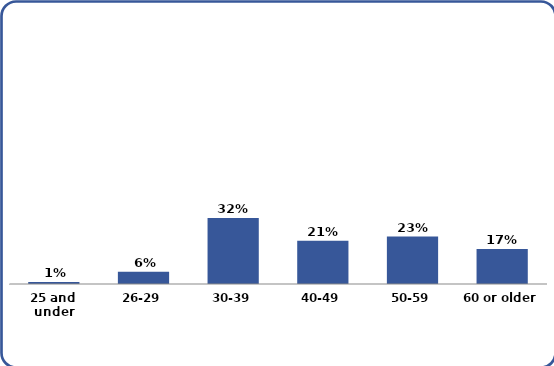
| Category | Series 0 |
|---|---|
| 25 and under | 0.01 |
| 26-29 | 0.06 |
| 30-39 | 0.32 |
| 40-49 | 0.21 |
| 50-59 | 0.23 |
| 60 or older | 0.17 |